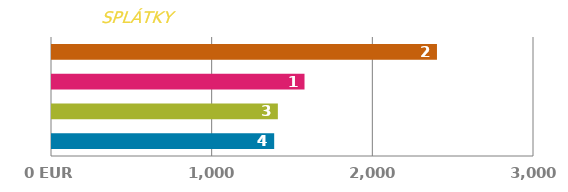
| Category | VOPRED |
|---|---|
| 0 | 1382.921 |
| 1 | 1405.775 |
| 2 | 1571.655 |
| 3 | 2396.046 |